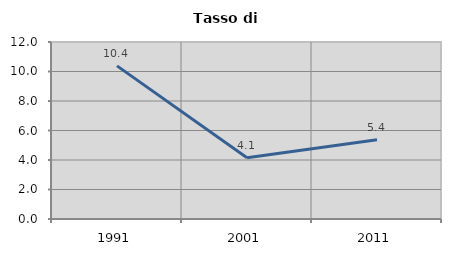
| Category | Tasso di disoccupazione   |
|---|---|
| 1991.0 | 10.381 |
| 2001.0 | 4.149 |
| 2011.0 | 5.372 |